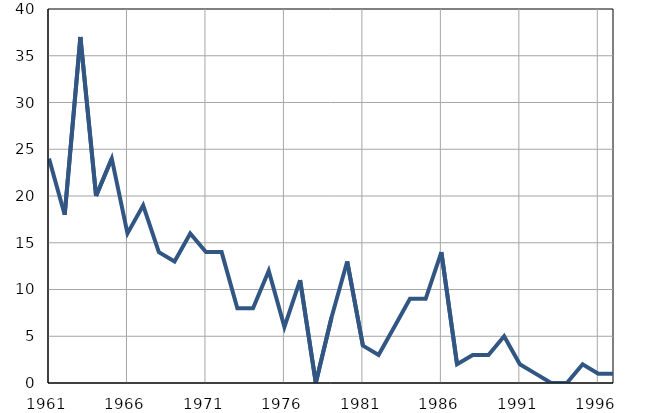
| Category | Умрла 
одојчад |
|---|---|
| 1961.0 | 24 |
| 1962.0 | 18 |
| 1963.0 | 37 |
| 1964.0 | 20 |
| 1965.0 | 24 |
| 1966.0 | 16 |
| 1967.0 | 19 |
| 1968.0 | 14 |
| 1969.0 | 13 |
| 1970.0 | 16 |
| 1971.0 | 14 |
| 1972.0 | 14 |
| 1973.0 | 8 |
| 1974.0 | 8 |
| 1975.0 | 12 |
| 1976.0 | 6 |
| 1977.0 | 11 |
| 1978.0 | 0 |
| 1979.0 | 7 |
| 1980.0 | 13 |
| 1981.0 | 4 |
| 1982.0 | 3 |
| 1983.0 | 6 |
| 1984.0 | 9 |
| 1985.0 | 9 |
| 1986.0 | 14 |
| 1987.0 | 2 |
| 1988.0 | 3 |
| 1989.0 | 3 |
| 1990.0 | 5 |
| 1991.0 | 2 |
| 1992.0 | 1 |
| 1993.0 | 0 |
| 1994.0 | 0 |
| 1995.0 | 2 |
| 1996.0 | 1 |
| 1997.0 | 1 |